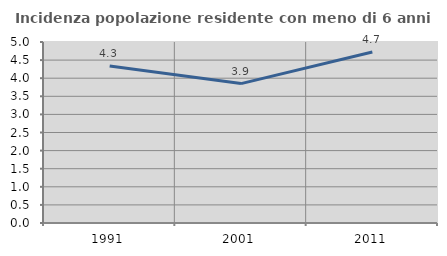
| Category | Incidenza popolazione residente con meno di 6 anni |
|---|---|
| 1991.0 | 4.34 |
| 2001.0 | 3.851 |
| 2011.0 | 4.724 |